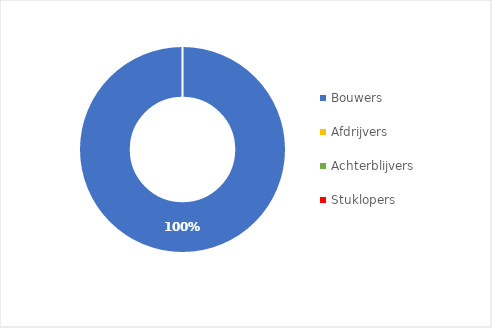
| Category | Series 0 |
|---|---|
| Bouwers | 1 |
| Afdrijvers | 0 |
| Achterblijvers | 0 |
| Stuklopers | 0 |